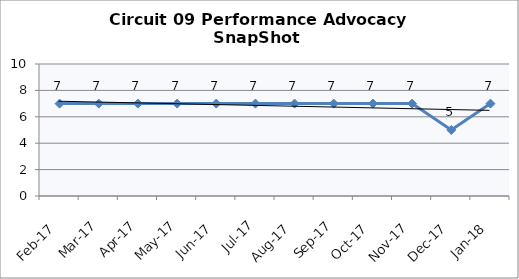
| Category | Circuit 09 |
|---|---|
| Feb-17 | 7 |
| Mar-17 | 7 |
| Apr-17 | 7 |
| May-17 | 7 |
| Jun-17 | 7 |
| Jul-17 | 7 |
| Aug-17 | 7 |
| Sep-17 | 7 |
| Oct-17 | 7 |
| Nov-17 | 7 |
| Dec-17 | 5 |
| Jan-18 | 7 |